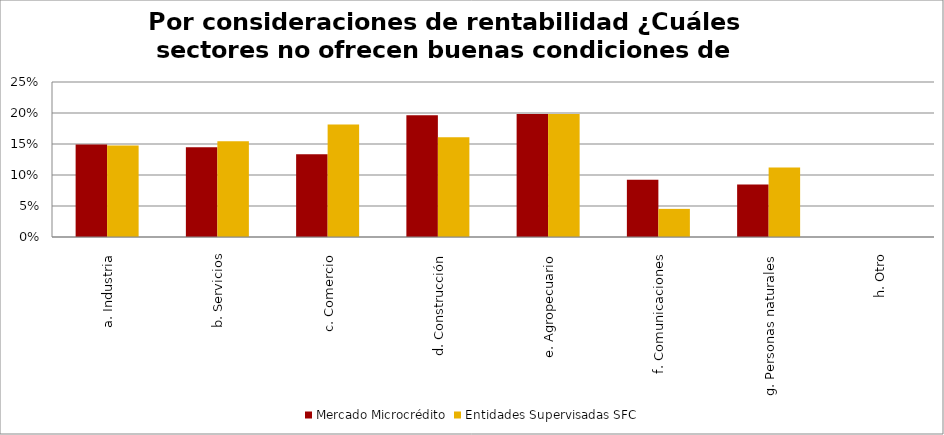
| Category | Mercado Microcrédito | Entidades Supervisadas SFC |
|---|---|---|
| a. Industria | 0.149 | 0.147 |
| b. Servicios | 0.145 | 0.154 |
| c. Comercio | 0.134 | 0.181 |
| d. Construcción | 0.196 | 0.161 |
| e. Agropecuario | 0.198 | 0.198 |
| f. Comunicaciones | 0.092 | 0.045 |
| g. Personas naturales | 0.085 | 0.112 |
| h. Otro | 0 | 0 |